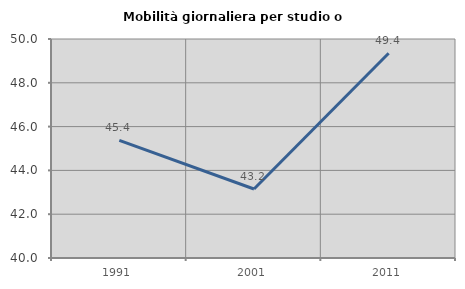
| Category | Mobilità giornaliera per studio o lavoro |
|---|---|
| 1991.0 | 45.373 |
| 2001.0 | 43.151 |
| 2011.0 | 49.351 |